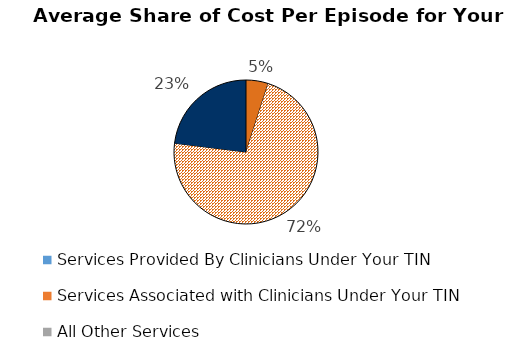
| Category | Series 2 | Series 3 | Series 5 | Series 4 | Series 0 | Series 1 |
|---|---|---|---|---|---|---|
| Services Provided By Clinicians Under Your TIN | 0.05 | 0.061 | 0.064 | 0.05 | 0.061 | 0.064 |
| Services Associated with Clinicians Under Your TIN | 0.72 | 0.739 | 0.741 | 0.72 | 0.739 | 0.741 |
| All Other Services | 0.23 | 0.201 | 0.195 | 0.23 | 0.201 | 0.195 |